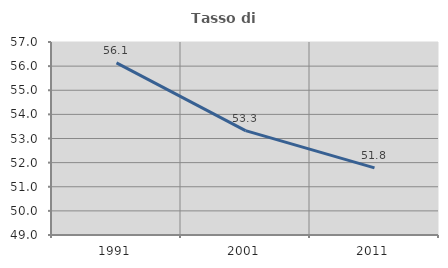
| Category | Tasso di occupazione   |
|---|---|
| 1991.0 | 56.133 |
| 2001.0 | 53.325 |
| 2011.0 | 51.785 |